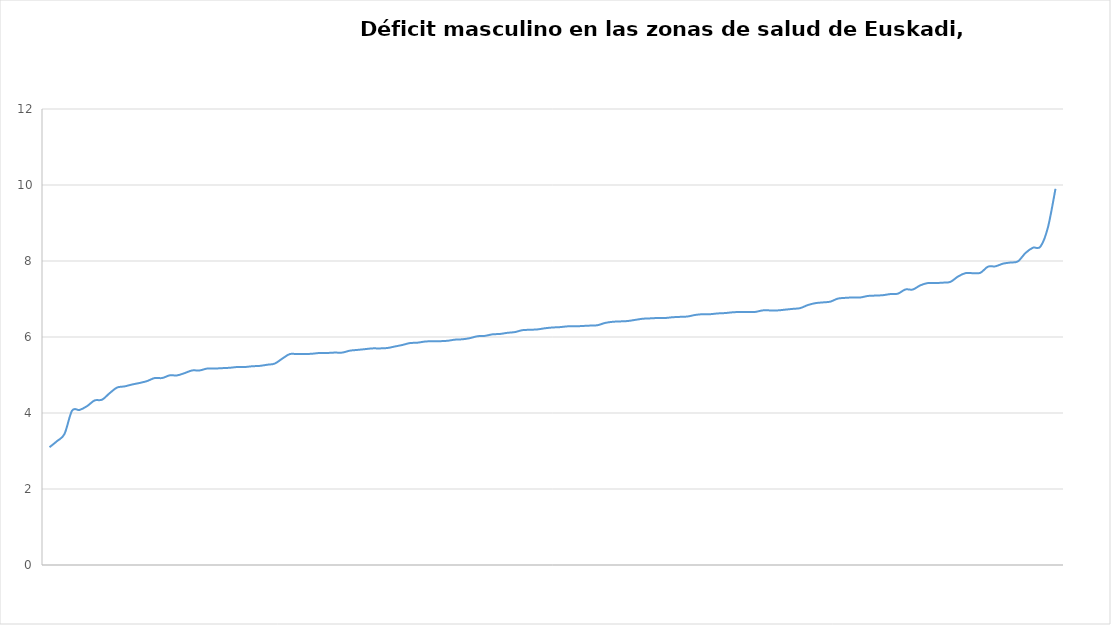
| Category | araba |
|---|---|
| 0 | 3.1 |
| 1 | 3.26 |
| 2 | 3.45 |
| 3 | 4.06 |
| 4 | 4.08 |
| 5 | 4.18 |
| 6 | 4.33 |
| 7 | 4.35 |
| 8 | 4.52 |
| 9 | 4.67 |
| 10 | 4.7 |
| 11 | 4.75 |
| 12 | 4.79 |
| 13 | 4.84 |
| 14 | 4.92 |
| 15 | 4.92 |
| 16 | 4.99 |
| 17 | 4.99 |
| 18 | 5.05 |
| 19 | 5.12 |
| 20 | 5.12 |
| 21 | 5.17 |
| 22 | 5.17 |
| 23 | 5.18 |
| 24 | 5.19 |
| 25 | 5.21 |
| 26 | 5.21 |
| 27 | 5.23 |
| 28 | 5.24 |
| 29 | 5.27 |
| 30 | 5.3 |
| 31 | 5.43 |
| 32 | 5.55 |
| 33 | 5.55 |
| 34 | 5.55 |
| 35 | 5.56 |
| 36 | 5.58 |
| 37 | 5.58 |
| 38 | 5.59 |
| 39 | 5.59 |
| 40 | 5.64 |
| 41 | 5.66 |
| 42 | 5.68 |
| 43 | 5.7 |
| 44 | 5.7 |
| 45 | 5.71 |
| 46 | 5.75 |
| 47 | 5.79 |
| 48 | 5.84 |
| 49 | 5.85 |
| 50 | 5.88 |
| 51 | 5.89 |
| 52 | 5.89 |
| 53 | 5.9 |
| 54 | 5.93 |
| 55 | 5.94 |
| 56 | 5.97 |
| 57 | 6.02 |
| 58 | 6.03 |
| 59 | 6.07 |
| 60 | 6.08 |
| 61 | 6.11 |
| 62 | 6.13 |
| 63 | 6.18 |
| 64 | 6.19 |
| 65 | 6.2 |
| 66 | 6.23 |
| 67 | 6.25 |
| 68 | 6.26 |
| 69 | 6.28 |
| 70 | 6.28 |
| 71 | 6.29 |
| 72 | 6.3 |
| 73 | 6.31 |
| 74 | 6.37 |
| 75 | 6.4 |
| 76 | 6.41 |
| 77 | 6.42 |
| 78 | 6.45 |
| 79 | 6.48 |
| 80 | 6.49 |
| 81 | 6.5 |
| 82 | 6.5 |
| 83 | 6.52 |
| 84 | 6.53 |
| 85 | 6.54 |
| 86 | 6.58 |
| 87 | 6.6 |
| 88 | 6.6 |
| 89 | 6.62 |
| 90 | 6.63 |
| 91 | 6.65 |
| 92 | 6.66 |
| 93 | 6.66 |
| 94 | 6.66 |
| 95 | 6.7 |
| 96 | 6.7 |
| 97 | 6.7 |
| 98 | 6.72 |
| 99 | 6.74 |
| 100 | 6.76 |
| 101 | 6.84 |
| 102 | 6.89 |
| 103 | 6.91 |
| 104 | 6.93 |
| 105 | 7.01 |
| 106 | 7.03 |
| 107 | 7.04 |
| 108 | 7.04 |
| 109 | 7.08 |
| 110 | 7.09 |
| 111 | 7.1 |
| 112 | 7.13 |
| 113 | 7.14 |
| 114 | 7.25 |
| 115 | 7.25 |
| 116 | 7.36 |
| 117 | 7.42 |
| 118 | 7.42 |
| 119 | 7.43 |
| 120 | 7.45 |
| 121 | 7.59 |
| 122 | 7.68 |
| 123 | 7.68 |
| 124 | 7.69 |
| 125 | 7.85 |
| 126 | 7.86 |
| 127 | 7.93 |
| 128 | 7.96 |
| 129 | 7.99 |
| 130 | 8.21 |
| 131 | 8.35 |
| 132 | 8.38 |
| 133 | 8.89 |
| 134 | 9.9 |